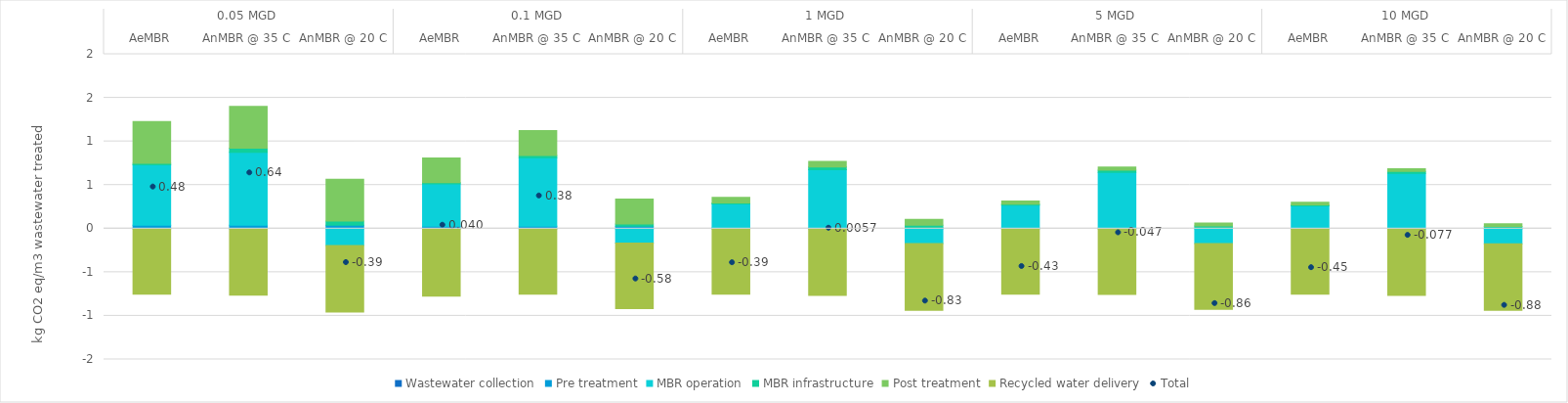
| Category | Wastewater collection | Pre treatment | MBR operation | MBR infrastructure | Post treatment | Recycled water delivery |
|---|---|---|---|---|---|---|
| 0 | 0 | 0.041 | 0.693 | 0.015 | 0.48 | -0.75 |
| 1 | 0 | 0.041 | 0.834 | 0.048 | 0.48 | -0.763 |
| 2 | 0 | 0.041 | -0.194 | 0.048 | 0.48 | -0.763 |
| 3 | 0 | 0.028 | 0.485 | 0.013 | 0.285 | -0.773 |
| 4 | 0 | 0.028 | 0.786 | 0.025 | 0.285 | -0.75 |
| 5 | 0 | 0.028 | -0.166 | 0.025 | 0.285 | -0.75 |
| 6 | 0 | 0.009 | 0.274 | 0.011 | 0.065 | -0.751 |
| 7 | 0 | 0.009 | 0.666 | 0.031 | 0.065 | -0.766 |
| 8 | 0 | 0.009 | -0.17 | 0.031 | 0.065 | -0.766 |
| 9 | 0 | 0.004 | 0.266 | 0.01 | 0.036 | -0.75 |
| 10 | 0 | 0.004 | 0.64 | 0.026 | 0.036 | -0.753 |
| 11 | 0 | 0.004 | -0.172 | 0.026 | 0.036 | -0.753 |
| 12 | 0 | 0.003 | 0.259 | 0.01 | 0.031 | -0.75 |
| 13 | 0 | 0.003 | 0.63 | 0.023 | 0.031 | -0.764 |
| 14 | 0 | 0.003 | -0.173 | 0.023 | 0.031 | -0.764 |